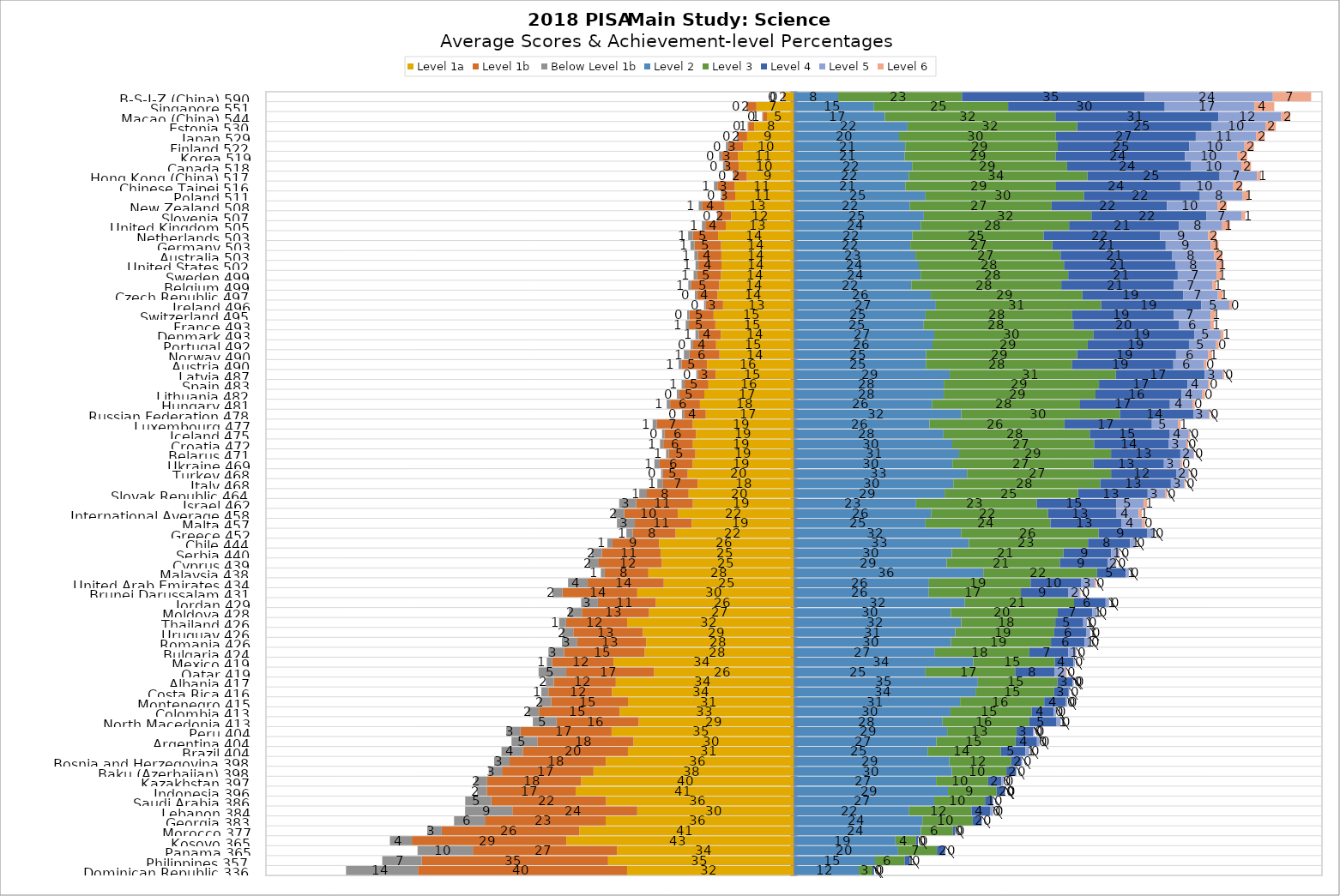
| Category | Level 1a | Level 1b  | Below Level 1b | Level 2 | Level 3 | Level 4 | Level 5 | Level 6 |
|---|---|---|---|---|---|---|---|---|
| Dominican Republic 336 | -31.605 | -39.607 | -13.623 | 12.27 | 2.59 | 0.297 | 0.008 | 0 |
| Philippines 357 | -35.205 | -35.288 | -7.477 | 15.357 | 5.609 | 1.008 | 0.056 | 0 |
| Panama 365 | -33.511 | -27.31 | -10.464 | 19.726 | 7.361 | 1.517 | 0.111 | 0 |
| Kosovo 365 | -43.094 | -29.274 | -4.152 | 19.222 | 3.898 | 0.358 | 0.002 | 0 |
| Morocco 377 | -40.664 | -26.051 | -2.735 | 24.049 | 6.064 | 0.427 | 0.009 | 0 |
| Georgia 383 | -35.664 | -22.885 | -5.829 | 24.321 | 9.53 | 1.669 | 0.103 | 0 |
| Lebanon 384 | -29.684 | -23.648 | -8.947 | 21.82 | 11.807 | 3.589 | 0.481 | 0.024 |
| Saudi Arabia 386 | -35.587 | -21.729 | -4.94 | 26.559 | 9.618 | 1.481 | 0.086 | 0 |
| Indonesia 396 | -41.352 | -16.831 | -1.821 | 29.171 | 9.214 | 1.551 | 0.06 | 0.001 |
| Kazakhstan 397 | -40.295 | -17.819 | -2.216 | 26.91 | 9.874 | 2.498 | 0.369 | 0.019 |
| Baku (Azerbaijan) 398 | -37.965 | -17.336 | -2.524 | 29.906 | 10.327 | 1.821 | 0.121 | 0 |
| Bosnia and Herzegovina 398 | -35.637 | -18.216 | -2.926 | 29.439 | 11.708 | 1.94 | 0.134 | 0 |
| Brazil 404 | -31.444 | -19.919 | -4.025 | 25.301 | 13.896 | 4.62 | 0.76 | 0.036 |
| Argentina 404 | -30.389 | -18.214 | -4.887 | 26.972 | 14.991 | 4.056 | 0.477 | 0.014 |
| Peru 404 | -34.541 | -17.255 | -2.689 | 29.015 | 13.161 | 3.121 | 0.214 | 0.005 |
| North Macedonia 413 | -29.413 | -15.537 | -4.507 | 28.154 | 16.417 | 5.162 | 0.769 | 0.042 |
| Colombia 413 | -32.99 | -15.31 | -2.067 | 29.641 | 15.367 | 4.184 | 0.429 | 0.012 |
| Montenegro 415 | -31.439 | -14.553 | -2.233 | 31.461 | 15.937 | 4.046 | 0.33 | 0.001 |
| Costa Rica 416 | -34.462 | -12.045 | -1.337 | 34.379 | 14.901 | 2.758 | 0.119 | 0 |
| Albania 417 | -33.742 | -11.74 | -1.536 | 34.827 | 15.084 | 2.867 | 0.201 | 0.004 |
| Qatar 419 | -26.48 | -16.646 | -5.237 | 24.915 | 16.971 | 7.518 | 1.999 | 0.232 |
| Mexico 419 | -34.181 | -11.606 | -1.021 | 33.95 | 15.454 | 3.536 | 0.253 | 0 |
| Bulgaria 424 | -28.275 | -15.282 | -2.95 | 26.698 | 17.879 | 7.398 | 1.438 | 0.08 |
| Romania 426 | -27.99 | -13.051 | -2.905 | 29.762 | 18.912 | 6.401 | 0.929 | 0.05 |
| Uruguay 426 | -28.605 | -13.188 | -2.082 | 30.554 | 18.737 | 6.119 | 0.684 | 0.031 |
| Thailand 426 | -31.595 | -11.567 | -1.322 | 31.671 | 17.824 | 5.3 | 0.706 | 0.016 |
| Moldova 428 | -27.441 | -12.736 | -2.426 | 29.71 | 20.25 | 6.565 | 0.847 | 0.024 |
| Jordan 429 | -26.166 | -10.966 | -3.175 | 32.369 | 20.677 | 5.977 | 0.642 | 0.028 |
| Brunei Darussalam 431 | -29.676 | -14.196 | -1.862 | 25.549 | 17.434 | 9.016 | 2.128 | 0.14 |
| United Arab Emirates 434 | -24.663 | -14.398 | -3.729 | 25.57 | 19.238 | 9.546 | 2.586 | 0.27 |
| Malaysia 438 | -27.571 | -8.271 | -0.737 | 35.858 | 21.542 | 5.428 | 0.588 | 0.005 |
| Cyprus 439 | -25.027 | -11.94 | -1.985 | 28.918 | 21.429 | 9.056 | 1.53 | 0.115 |
| Serbia 440 | -25.273 | -11.11 | -1.94 | 29.893 | 21.137 | 9.053 | 1.497 | 0.096 |
| Chile 444 | -25.544 | -8.827 | -0.972 | 33.125 | 22.562 | 7.94 | 0.996 | 0.034 |
| Greece 452 | -22.415 | -8.13 | -1.192 | 31.644 | 26.043 | 9.266 | 1.263 | 0.048 |
| Malta 457 | -19.377 | -10.758 | -3.387 | 24.913 | 23.667 | 13.487 | 3.924 | 0.487 |
| International Average 458 | -21.984 | -10.16 | -1.956 | 25.959 | 22.146 | 13.002 | 4.176 | 0.615 |
| Israel 462 | -19.155 | -10.714 | -3.23 | 23.125 | 22.851 | 15.106 | 5.165 | 0.653 |
| Slovak Republic 464 | -19.945 | -7.918 | -1.439 | 28.53 | 25.262 | 13.199 | 3.385 | 0.322 |
| Italy 468 | -18.244 | -6.551 | -1.085 | 30.184 | 27.822 | 13.381 | 2.559 | 0.175 |
| Turkey 468 | -20.123 | -4.695 | -0.334 | 32.773 | 27.285 | 12.329 | 2.338 | 0.123 |
| Ukraine 469 | -19.174 | -6.267 | -0.993 | 30.014 | 26.669 | 13.389 | 3.167 | 0.327 |
| Belarus 471 | -18.664 | -5.036 | -0.518 | 31.269 | 28.781 | 13.125 | 2.473 | 0.132 |
| Croatia 472 | -19.143 | -5.605 | -0.62 | 29.979 | 26.865 | 14.156 | 3.32 | 0.312 |
| Iceland 475 | -18.559 | -5.928 | -0.497 | 28.322 | 27.699 | 15.168 | 3.601 | 0.227 |
| Luxembourg 477 | -19.164 | -6.782 | -0.819 | 25.68 | 25.555 | 16.551 | 4.934 | 0.515 |
| Russian Federation 478 | -16.707 | -4.12 | -0.386 | 31.697 | 30.025 | 13.983 | 2.874 | 0.209 |
| Hungary 481 | -17.806 | -5.651 | -0.647 | 26.11 | 28.075 | 17.015 | 4.29 | 0.406 |
| Lithuania 482 | -16.977 | -4.73 | -0.478 | 28.363 | 28.742 | 16.27 | 3.975 | 0.465 |
| Spain 483 | -16.198 | -4.526 | -0.551 | 28.369 | 29.402 | 16.77 | 3.871 | 0.313 |
| Latvia 487 | -14.823 | -3.367 | -0.3 | 29.497 | 31.47 | 16.82 | 3.468 | 0.256 |
| Austria 490 | -16.452 | -4.841 | -0.558 | 24.976 | 27.64 | 19.238 | 5.841 | 0.455 |
| Norway 490 | -14.102 | -5.685 | -1.058 | 25.045 | 28.581 | 18.739 | 6.054 | 0.735 |
| Portugal 492 | -14.743 | -4.37 | -0.448 | 26.242 | 29.388 | 19.185 | 5.142 | 0.482 |
| Denmark 493 | -13.851 | -4.147 | -0.657 | 26.568 | 30.115 | 19.134 | 5 | 0.527 |
| France 493 | -14.892 | -5.005 | -0.602 | 24.574 | 28.346 | 20.03 | 5.913 | 0.638 |
| Switzerland 495 | -15.218 | -4.584 | -0.423 | 24.923 | 27.773 | 19.274 | 6.946 | 0.86 |
| Ireland 496 | -13.435 | -3.273 | -0.319 | 26.873 | 31.309 | 18.951 | 5.365 | 0.475 |
| Czech Republic 497 | -14.485 | -3.898 | -0.381 | 25.925 | 28.712 | 19.064 | 6.584 | 0.95 |
| Belgium 499 | -14.151 | -5.306 | -0.551 | 22.225 | 28.403 | 21.332 | 7.318 | 0.716 |
| Sweden 499 | -13.823 | -4.561 | -0.623 | 23.991 | 27.95 | 20.749 | 7.348 | 0.954 |
| United States 502 | -13.733 | -4.363 | -0.546 | 23.64 | 27.501 | 21.084 | 7.862 | 1.271 |
| Australia 503 | -13.748 | -4.467 | -0.645 | 23.002 | 27.494 | 21.163 | 7.924 | 1.557 |
| Germany 503 | -13.807 | -5.031 | -0.762 | 22.031 | 26.919 | 21.455 | 8.512 | 1.482 |
| Netherlands 503 | -14.376 | -4.765 | -0.898 | 22.437 | 24.86 | 22.054 | 9.1 | 1.509 |
| United Kingdom 505 | -12.918 | -3.874 | -0.642 | 24 | 28.101 | 20.785 | 8.227 | 1.452 |
| Slovenia 507 | -11.887 | -2.472 | -0.196 | 24.594 | 31.753 | 21.759 | 6.718 | 0.62 |
| New Zealand 508 | -13.119 | -4.312 | -0.611 | 21.969 | 26.83 | 21.848 | 9.539 | 1.772 |
| Poland 511 | -11.129 | -2.504 | -0.209 | 24.915 | 29.987 | 21.975 | 8.113 | 1.167 |
| Chinese Taipei 516 | -11.211 | -3.283 | -0.653 | 21.091 | 28.54 | 23.55 | 10.038 | 1.633 |
| Hong Kong (China) 517 | -8.931 | -2.449 | -0.182 | 21.727 | 33.842 | 25.042 | 7.121 | 0.705 |
| Canada 518 | -10.461 | -2.575 | -0.399 | 22.38 | 29.349 | 23.503 | 9.508 | 1.824 |
| Korea 519 | -10.623 | -3.069 | -0.475 | 20.972 | 28.584 | 24.484 | 9.994 | 1.799 |
| Finland 522 | -9.652 | -2.797 | -0.438 | 21.075 | 28.887 | 24.885 | 10.478 | 1.789 |
| Japan 529 | -8.871 | -1.818 | -0.155 | 19.9 | 29.695 | 26.509 | 11.407 | 1.646 |
| Estonia 530 | -7.533 | -1.129 | -0.095 | 21.512 | 32.106 | 25.425 | 10.246 | 1.953 |
| Macao (China) 544 | -5.122 | -0.78 | -0.097 | 17.222 | 32.296 | 30.845 | 11.933 | 1.704 |
| Singapore 551 | -7.105 | -1.768 | -0.164 | 15.147 | 25.404 | 29.666 | 16.973 | 3.772 |
| B-S-J-Z (China) 590 | -1.758 | -0.254 | -0.039 | 8.37 | 23.449 | 34.624 | 24.259 | 7.247 |